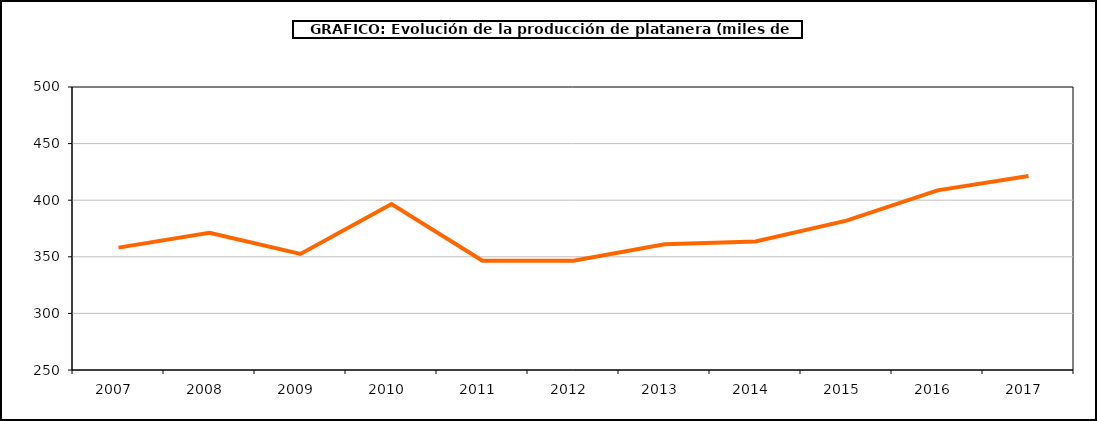
| Category | producción platanera |
|---|---|
| 2007.0 | 358.117 |
| 2008.0 | 371.228 |
| 2009.0 | 352.522 |
| 2010.0 | 396.589 |
| 2011.0 | 346.509 |
| 2012.0 | 346.509 |
| 2013.0 | 360.987 |
| 2014.0 | 363.552 |
| 2015.0 | 381.983 |
| 2016.0 | 408.716 |
| 2017.0 | 421.313 |